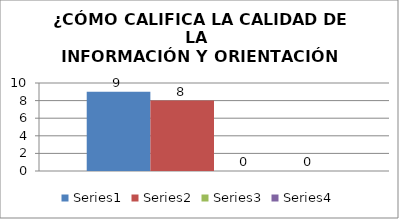
| Category | Series 0 | Series 1 | Series 2 | Series 3 |
|---|---|---|---|---|
| 0 | 9 | 8 | 0 | 0 |